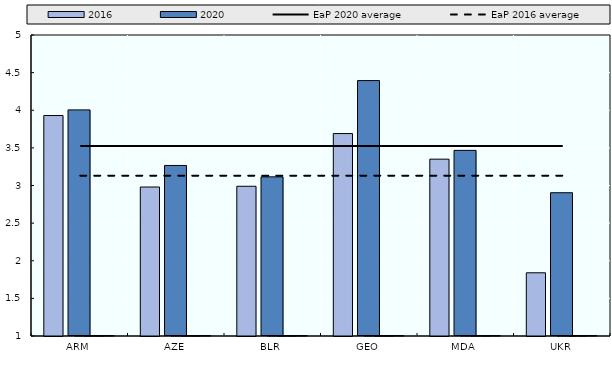
| Category | 2020 | Difference with 2020 according to 2016 methodology |
|---|---|---|
| ARM | 4.005 | 0 |
| AZE | 3.266 | 0 |
| BLR | 3.115 | 0 |
| GEO | 4.394 | 0 |
| MDA | 3.467 | 0 |
| UKR | 2.904 | 0 |